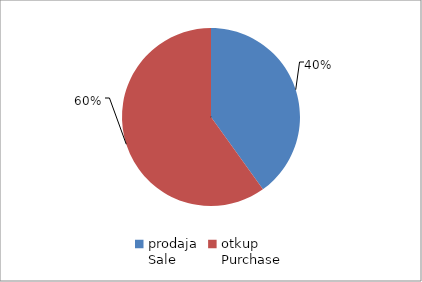
| Category | Series 0 |
|---|---|
| prodaja
Sale | 9120282 |
| otkup
Purchase | 13631921 |